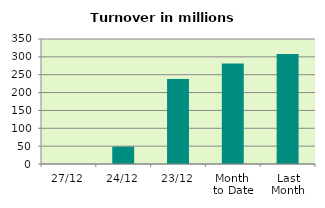
| Category | Series 0 |
|---|---|
| 27/12 | 0 |
| 24/12 | 48.614 |
| 23/12 | 238.005 |
| Month 
to Date | 281.259 |
| Last
Month | 307.664 |